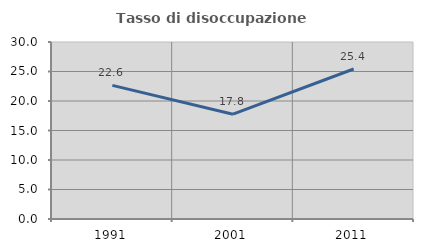
| Category | Tasso di disoccupazione giovanile  |
|---|---|
| 1991.0 | 22.643 |
| 2001.0 | 17.764 |
| 2011.0 | 25.42 |